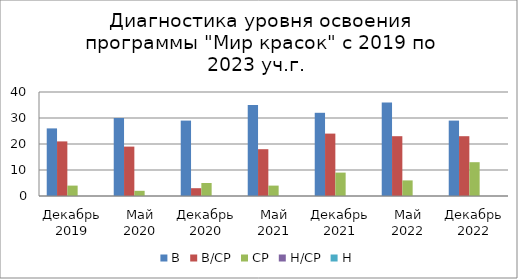
| Category | В | В/СР | СР | Н/СР | Н |
|---|---|---|---|---|---|
| Декабрь 2019 | 26 | 21 | 4 | 0 | 0 |
| Май 2020 | 30 | 19 | 2 | 0 | 0 |
| Декабрь 2020 | 29 | 3 | 5 | 0 | 0 |
| Май 2021 | 35 | 18 | 4 | 0 | 0 |
| Декабрь 2021 | 32 | 24 | 9 | 0 | 0 |
| Май 2022 | 36 | 23 | 6 | 0 | 0 |
| Декабрь 2022 | 29 | 23 | 13 | 0 | 0 |